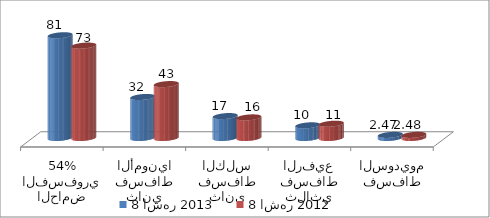
| Category | 8 اشهر 2013 | 8 اشهر 2012 |
|---|---|---|
| الحامض الفسفوري 54% | 81.28 | 73.106 |
| ثاني فسفاط الأمونيا | 32.455 | 42.652 |
| ثاني فسفاط الكلس | 17.334 | 16.302 |
| ثلاثي فسفاط الرفيع | 10.019 | 11.289 |
| فسفاط السوديوم | 2.47 | 2.481 |